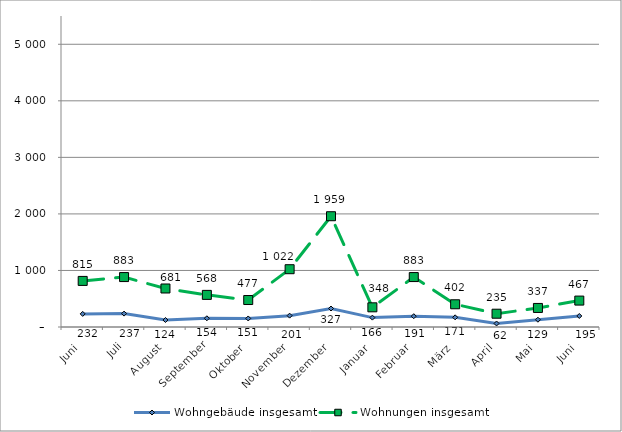
| Category | Wohngebäude insgesamt | Wohnungen insgesamt |
|---|---|---|
| Juni | 232 | 815 |
| Juli | 237 | 883 |
| August | 124 | 681 |
| September | 154 | 568 |
| Oktober | 151 | 477 |
| November | 201 | 1022 |
| Dezember | 327 | 1959 |
| Januar | 166 | 348 |
| Februar | 191 | 883 |
| März | 171 | 402 |
| April | 62 | 235 |
| Mai | 129 | 337 |
| Juni | 195 | 467 |